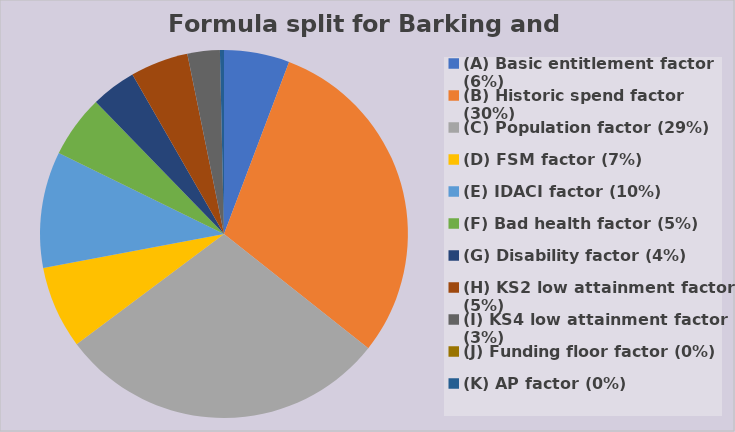
| Category | Series 0 |
|---|---|
| (A) Basic entitlement factor (6%) | 2400888.924 |
| (B) Historic spend factor (30%) | 12482620.907 |
| (C) Population factor (29%) | 12155942.824 |
| (D) FSM factor (7%) | 3026862.271 |
| (E) IDACI factor (10%) | 4264642.932 |
| (F) Bad health factor (5%) | 2291067.49 |
| (G) Disability factor (4%) | 1655226.554 |
| (H) KS2 low attainment factor (5%) | 2125623.331 |
| (I) KS4 low attainment factor (3%) | 1186487.87 |
| (J) Funding floor factor (0%) | 0 |
| (K) AP factor (0%) | 148381.714 |